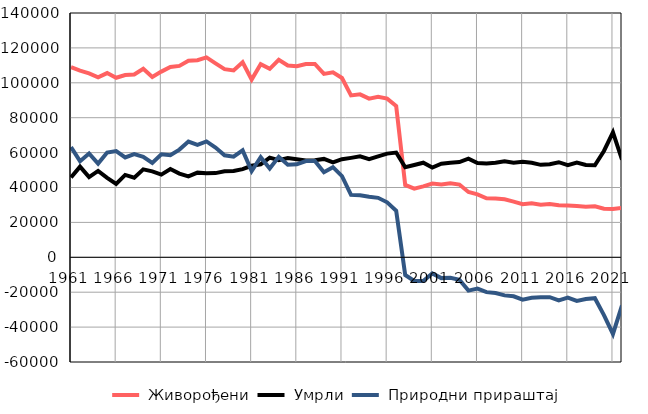
| Category |  Живорођени |  Умрли |  Природни прираштај |
|---|---|---|---|
| 1961.0 | 108995 | 45819 | 63176 |
| 1962.0 | 107002 | 51931 | 55071 |
| 1963.0 | 105437 | 45933 | 59504 |
| 1964.0 | 103200 | 49512 | 53688 |
| 1965.0 | 105564 | 45537 | 60027 |
| 1966.0 | 102880 | 42013 | 60867 |
| 1967.0 | 104428 | 47193 | 57235 |
| 1968.0 | 104781 | 45634 | 59147 |
| 1969.0 | 108032 | 50405 | 57627 |
| 1970.0 | 103348 | 49214 | 54134 |
| 1971.0 | 106410 | 47388 | 59022 |
| 1972.0 | 109090 | 50594 | 58496 |
| 1973.0 | 109669 | 47949 | 61720 |
| 1974.0 | 112640 | 46334 | 66306 |
| 1975.0 | 112914 | 48512 | 64402 |
| 1976.0 | 114571 | 48167 | 66404 |
| 1977.0 | 111176 | 48259 | 62917 |
| 1978.0 | 107812 | 49324 | 58488 |
| 1979.0 | 107107 | 49411 | 57696 |
| 1980.0 | 111786 | 50488 | 61298 |
| 1981.0 | 101876 | 52434 | 49442 |
| 1982.0 | 110688 | 53316 | 57372 |
| 1983.0 | 107977 | 57116 | 50861 |
| 1984.0 | 113208 | 55639 | 57569 |
| 1985.0 | 109887 | 56894 | 52993 |
| 1986.0 | 109536 | 56222 | 53314 |
| 1987.0 | 110717 | 55540 | 55177 |
| 1988.0 | 110800 | 55621 | 55179 |
| 1989.0 | 105123 | 56381 | 48742 |
| 1990.0 | 106002 | 54364 | 51638 |
| 1991.0 | 102764 | 56225 | 46539 |
| 1992.0 | 92750 | 56984 | 35766 |
| 1993.0 | 93360 | 57851 | 35509 |
| 1994.0 | 90909 | 56259 | 34650 |
| 1995.0 | 91923 | 57841 | 34082 |
| 1996.0 | 90913 | 59413 | 31500 |
| 1997.0 | 86707 | 60034 | 26673 |
| 1998.0 | 41449 | 51592 | -10143 |
| 1999.0 | 39354 | 52899 | -13545 |
| 2000.0 | 40648 | 54208 | -13560 |
| 2001.0 | 42231 | 51466 | -9235 |
| 2002.0 | 41729 | 53658 | -11929 |
| 2003.0 | 42444 | 54160 | -11716 |
| 2004.0 | 41704 | 54563 | -12859 |
| 2005.0 | 37395 | 56492 | -19097 |
| 2006.0 | 36093 | 54067 | -17974 |
| 2007.0 | 33835 | 53806 | -19971 |
| 2008.0 | 33744 | 54217 | -20473 |
| 2009.0 | 33246 | 55066 | -21820 |
| 2010.0 | 31897 | 54246 | -22349 |
| 2011.0 | 30450 | 54690 | -24240 |
| 2012.0 | 30963 | 54205 | -23242 |
| 2013.0 | 30097 | 52977 | -22880 |
| 2014.0 | 30499 | 53366 | -22867 |
| 2015.0 | 29768 | 54499 | -24731 |
| 2016.0 | 29660 | 52797 | -23137 |
| 2017.0 | 29330 | 54320 | -24990 |
| 2018.0 | 28989 | 52932 | -23943 |
| 2019.0 | 29261 | 52713 | -23452 |
| 2020.0 | 27843 | 60930 | -33087 |
| 2021.0 | 27640 | 71579 | -43939 |
| 2022.0 | 28383 | 55989 | -27606 |